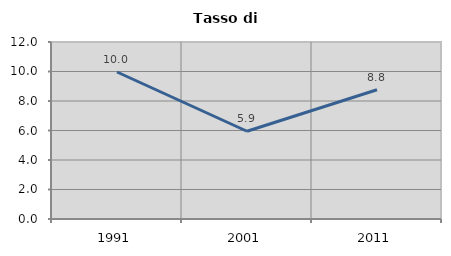
| Category | Tasso di disoccupazione   |
|---|---|
| 1991.0 | 9.966 |
| 2001.0 | 5.949 |
| 2011.0 | 8.765 |